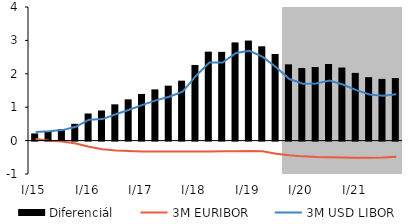
| Category | Diferenciál |
|---|---|
| I/15 | 0.215 |
| II | 0.286 |
| III | 0.342 |
| IV | 0.502 |
| I/16 | 0.811 |
| II | 0.902 |
| III | 1.086 |
| IV | 1.235 |
| I/17 | 1.397 |
| II | 1.533 |
| III | 1.645 |
| IV | 1.795 |
| I/18 | 2.265 |
| II | 2.663 |
| III | 2.657 |
| IV | 2.941 |
| I/19 | 2.995 |
| II | 2.824 |
| III | 2.593 |
| IV | 2.283 |
| I/20 | 2.173 |
| II | 2.202 |
| III | 2.294 |
| IV | 2.187 |
| I/21 | 2.028 |
| II | 1.898 |
| III | 1.848 |
| IV | 1.873 |